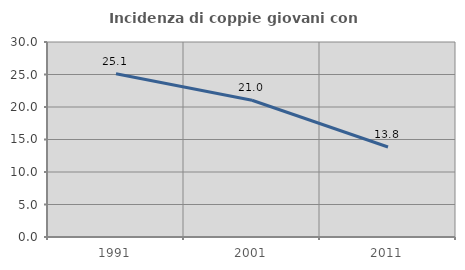
| Category | Incidenza di coppie giovani con figli |
|---|---|
| 1991.0 | 25.123 |
| 2001.0 | 21.033 |
| 2011.0 | 13.849 |